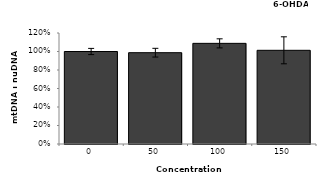
| Category | Series 1 |
|---|---|
| 0.0 | 1 |
| 50.0 | 0.987 |
| 100.0 | 1.088 |
| 150.0 | 1.013 |